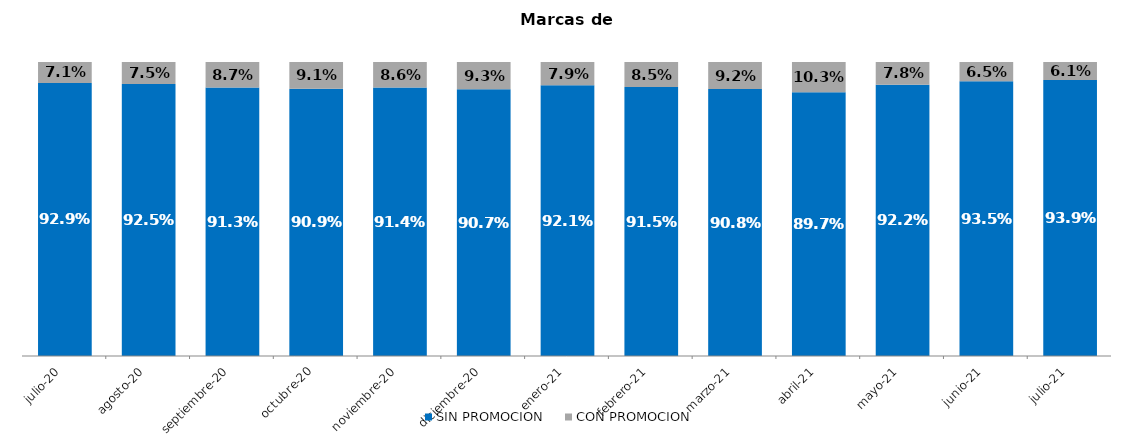
| Category | SIN PROMOCION   | CON PROMOCION   |
|---|---|---|
| 2020-07-01 | 0.929 | 0.071 |
| 2020-08-01 | 0.925 | 0.075 |
| 2020-09-01 | 0.913 | 0.087 |
| 2020-10-01 | 0.909 | 0.091 |
| 2020-11-01 | 0.914 | 0.086 |
| 2020-12-01 | 0.907 | 0.093 |
| 2021-01-01 | 0.921 | 0.079 |
| 2021-02-01 | 0.915 | 0.085 |
| 2021-03-01 | 0.908 | 0.092 |
| 2021-04-01 | 0.897 | 0.103 |
| 2021-05-01 | 0.922 | 0.078 |
| 2021-06-01 | 0.935 | 0.065 |
| 2021-07-01 | 0.939 | 0.061 |